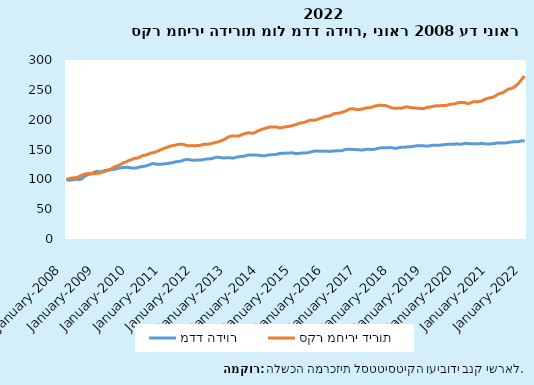
| Category | מדד הדיור | סקר מחירי דירות |
|---|---|---|
| 2008-01-31 | 100 | 100 |
| 2008-02-29 | 98.356 | 101.241 |
| 2008-03-31 | 98.767 | 102.321 |
| 2008-04-30 | 99.897 | 102.536 |
| 2008-05-31 | 100 | 103.292 |
| 2008-06-30 | 99.794 | 105.505 |
| 2008-07-31 | 102.158 | 107.555 |
| 2008-08-31 | 105.961 | 108.851 |
| 2008-09-30 | 108.016 | 109.876 |
| 2008-10-31 | 108.839 | 109.768 |
| 2008-11-30 | 111.511 | 109.444 |
| 2008-12-31 | 113.361 | 109.984 |
| 2009-01-31 | 112.53 | 110.254 |
| 2009-02-28 | 113.049 | 111.765 |
| 2009-03-31 | 114.816 | 113.276 |
| 2009-04-30 | 115.335 | 114.679 |
| 2009-05-31 | 115.958 | 116.298 |
| 2009-06-30 | 116.582 | 119.05 |
| 2009-07-31 | 116.998 | 121.587 |
| 2009-08-31 | 118.452 | 123.098 |
| 2009-09-30 | 119.283 | 125.148 |
| 2009-10-31 | 119.699 | 127.955 |
| 2009-11-30 | 120.426 | 129.358 |
| 2009-12-31 | 119.699 | 131.84 |
| 2010-01-31 | 118.972 | 133.351 |
| 2010-02-28 | 118.764 | 135.186 |
| 2010-03-31 | 119.491 | 135.51 |
| 2010-04-30 | 120.738 | 137.399 |
| 2010-05-31 | 121.569 | 140.043 |
| 2010-06-30 | 122.297 | 140.475 |
| 2010-07-31 | 123.544 | 142.31 |
| 2010-08-31 | 125.622 | 144.199 |
| 2010-09-30 | 126.453 | 144.684 |
| 2010-10-31 | 125.102 | 146.357 |
| 2010-11-30 | 125.102 | 148.57 |
| 2010-12-31 | 125.518 | 150.405 |
| 2011-01-31 | 126.009 | 152.186 |
| 2011-02-28 | 126.501 | 153.643 |
| 2011-03-31 | 127.115 | 155.586 |
| 2011-04-30 | 127.975 | 156.503 |
| 2011-05-31 | 129.325 | 157.366 |
| 2011-06-30 | 129.94 | 158.554 |
| 2011-07-31 | 130.431 | 158.877 |
| 2011-08-31 | 132.15 | 158.338 |
| 2011-09-30 | 133.378 | 156.881 |
| 2011-10-31 | 133.01 | 156.287 |
| 2011-11-30 | 132.027 | 156.557 |
| 2011-12-31 | 131.905 | 156.395 |
| 2012-01-31 | 132.273 | 156.557 |
| 2012-02-29 | 132.273 | 156.773 |
| 2012-03-31 | 132.764 | 158.338 |
| 2012-04-30 | 133.87 | 158.985 |
| 2012-05-31 | 134.238 | 158.877 |
| 2012-06-30 | 134.361 | 159.849 |
| 2012-07-31 | 135.712 | 160.982 |
| 2012-08-31 | 137.186 | 162.115 |
| 2012-09-30 | 137.063 | 163.303 |
| 2012-10-31 | 135.958 | 165.03 |
| 2012-11-30 | 135.712 | 167.134 |
| 2012-12-31 | 136.203 | 169.995 |
| 2013-01-31 | 136.066 | 172.153 |
| 2013-02-28 | 135.526 | 172.531 |
| 2013-03-31 | 136.605 | 172.693 |
| 2013-04-30 | 137.819 | 172.423 |
| 2013-05-31 | 138.224 | 174.096 |
| 2013-06-30 | 138.628 | 176.093 |
| 2013-07-31 | 139.977 | 177.226 |
| 2013-08-31 | 140.921 | 178.09 |
| 2013-09-30 | 140.786 | 177.28 |
| 2013-10-31 | 140.921 | 178.036 |
| 2013-11-30 | 140.516 | 180.734 |
| 2013-12-31 | 140.111 | 182.461 |
| 2014-01-31 | 139.302 | 184.296 |
| 2014-02-28 | 139.707 | 185.429 |
| 2014-03-31 | 140.921 | 187.048 |
| 2014-04-30 | 141.055 | 187.858 |
| 2014-05-31 | 141.46 | 187.588 |
| 2014-06-30 | 141.865 | 187.696 |
| 2014-07-31 | 143.078 | 186.4 |
| 2014-08-31 | 143.752 | 186.292 |
| 2014-09-30 | 143.752 | 187.75 |
| 2014-10-31 | 144.022 | 188.505 |
| 2014-11-30 | 144.292 | 189.045 |
| 2014-12-31 | 144.427 | 190.232 |
| 2015-01-31 | 143.123 | 191.473 |
| 2015-02-28 | 143.123 | 193.362 |
| 2015-03-31 | 144.119 | 194.603 |
| 2015-04-30 | 143.976 | 195.089 |
| 2015-05-31 | 144.403 | 196.708 |
| 2015-06-30 | 144.972 | 198.759 |
| 2015-07-31 | 146.395 | 199.244 |
| 2015-08-31 | 147.391 | 199.137 |
| 2015-09-30 | 147.533 | 200.378 |
| 2015-10-31 | 146.964 | 202.051 |
| 2015-11-30 | 146.964 | 203.724 |
| 2015-12-31 | 147.533 | 205.289 |
| 2016-01-31 | 146.822 | 205.828 |
| 2016-02-29 | 146.964 | 207.232 |
| 2016-03-31 | 147.533 | 209.984 |
| 2016-04-30 | 147.818 | 210.577 |
| 2016-05-31 | 147.818 | 211.063 |
| 2016-06-30 | 147.96 | 212.304 |
| 2016-07-31 | 149.667 | 213.761 |
| 2016-08-31 | 150.236 | 215.812 |
| 2016-09-30 | 150.378 | 218.133 |
| 2016-10-31 | 149.952 | 218.241 |
| 2016-11-30 | 149.809 | 217.377 |
| 2016-12-31 | 149.667 | 216.999 |
| 2017-01-31 | 148.969 | 217.377 |
| 2017-02-28 | 149.415 | 218.511 |
| 2017-03-31 | 150.604 | 219.536 |
| 2017-04-30 | 150.455 | 220.022 |
| 2017-05-31 | 150.009 | 220.993 |
| 2017-06-30 | 150.307 | 222.774 |
| 2017-07-31 | 151.645 | 223.583 |
| 2017-08-31 | 152.537 | 224.447 |
| 2017-09-30 | 153.131 | 223.745 |
| 2017-10-31 | 153.131 | 223.691 |
| 2017-11-30 | 152.983 | 222.288 |
| 2017-12-31 | 153.28 | 220.076 |
| 2018-01-31 | 152.388 | 219.266 |
| 2018-02-28 | 151.942 | 219.05 |
| 2018-03-31 | 153.28 | 219.374 |
| 2018-04-30 | 153.726 | 219.212 |
| 2018-05-31 | 153.726 | 220.831 |
| 2018-06-30 | 154.469 | 221.533 |
| 2018-07-31 | 154.469 | 220.237 |
| 2018-08-31 | 155.064 | 219.86 |
| 2018-09-30 | 155.956 | 219.428 |
| 2018-10-31 | 156.551 | 218.996 |
| 2018-11-30 | 156.253 | 218.834 |
| 2018-12-31 | 156.253 | 218.403 |
| 2019-01-31 | 155.551 | 220.345 |
| 2019-02-28 | 156.014 | 221.047 |
| 2019-03-31 | 157.25 | 221.695 |
| 2019-04-30 | 157.095 | 222.828 |
| 2019-05-31 | 157.095 | 223.475 |
| 2019-06-30 | 157.25 | 223.26 |
| 2019-07-31 | 157.868 | 223.907 |
| 2019-08-31 | 158.486 | 223.691 |
| 2019-09-30 | 158.795 | 224.825 |
| 2019-10-31 | 158.64 | 225.958 |
| 2019-11-30 | 158.64 | 226.174 |
| 2019-12-31 | 159.567 | 227.523 |
| 2020-01-31 | 158.949 | 228.656 |
| 2020-02-29 | 158.949 | 228.872 |
| 2020-03-31 | 160.339 | 228.656 |
| 2020-04-30 | 160.03 | 227.037 |
| 2020-05-31 | 159.567 | 227.739 |
| 2020-06-30 | 159.412 | 230.005 |
| 2020-07-31 | 159.721 | 230.005 |
| 2020-08-31 | 159.567 | 230.221 |
| 2020-09-30 | 160.03 | 230.923 |
| 2020-10-31 | 159.876 | 233.028 |
| 2020-11-30 | 159.258 | 235.132 |
| 2020-12-31 | 159.258 | 236.535 |
| 2021-01-31 | 159.726 | 237.021 |
| 2021-02-28 | 160.046 | 238.91 |
| 2021-03-31 | 161.003 | 242.04 |
| 2021-04-30 | 160.843 | 243.983 |
| 2021-05-31 | 160.684 | 245.224 |
| 2021-06-30 | 161.003 | 248.192 |
| 2021-07-31 | 161.641 | 251.16 |
| 2021-08-31 | 162.439 | 252.186 |
| 2021-09-30 | 162.918 | 254.182 |
| 2021-10-31 | 162.918 | 257.744 |
| 2021-11-30 | 163.396 | 262.115 |
| 2021-12-31 | 164.673 | 268.16 |
| 2022-01-31 | 164.833 | 272.963 |